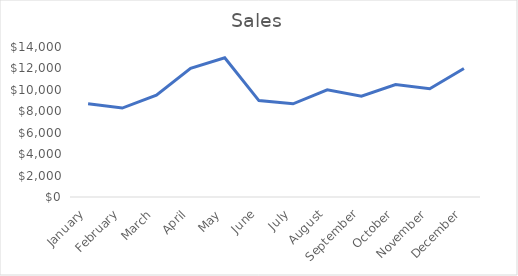
| Category | Sales |
|---|---|
| January | 8700 |
| February | 8300 |
| March | 9500 |
| April | 12000 |
| May | 13000 |
| June | 9000 |
| July | 8700 |
| August | 10000 |
| September | 9400 |
| October | 10500 |
| November | 10100 |
| December | 12000 |